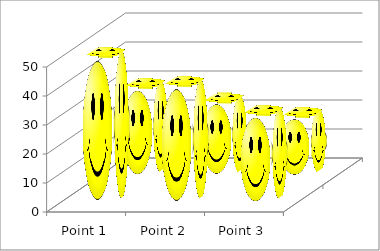
| Category | Series 1 | Series 2 |
|---|---|---|
| Point 1 | 50 | 30 |
| Point 2 | 40 | 25 |
| Point 3 | 30 | 20 |